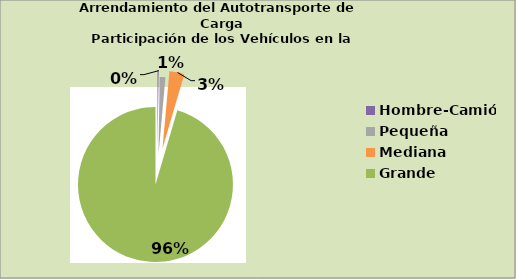
| Category | Series 0 |
|---|---|
| Hombre-Camión | 0.24 |
| Pequeña | 1.192 |
| Mediana | 3.115 |
| Grande | 95.454 |